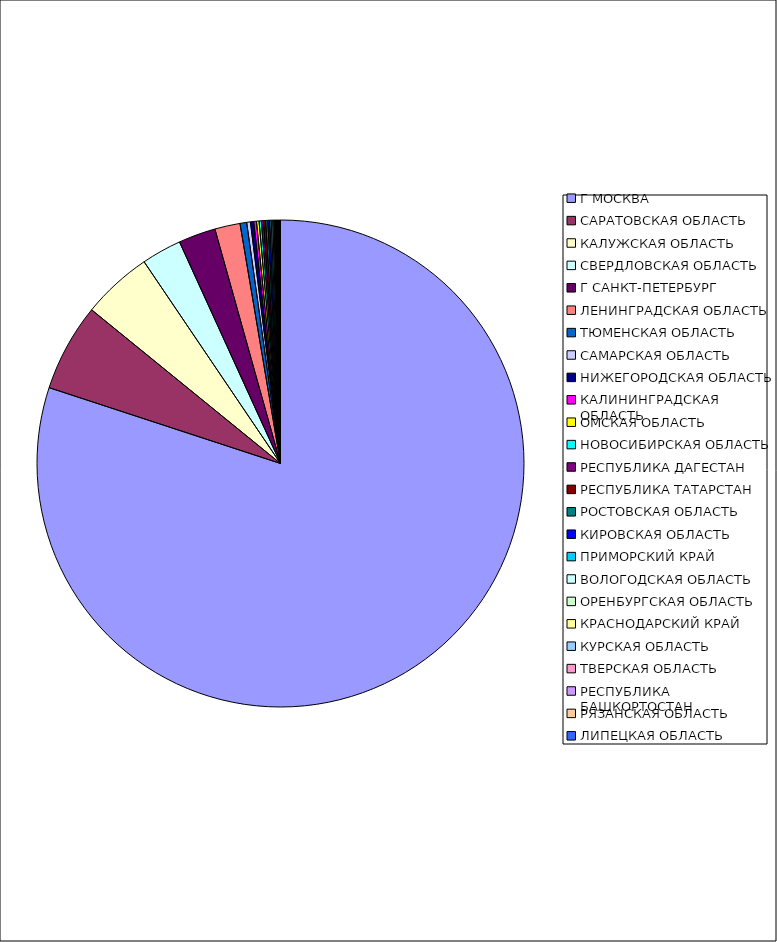
| Category | Оборот |
|---|---|
| Г МОСКВА | 0.8 |
| САРАТОВСКАЯ ОБЛАСТЬ | 0.058 |
| КАЛУЖСКАЯ ОБЛАСТЬ | 0.047 |
| СВЕРДЛОВСКАЯ ОБЛАСТЬ | 0.027 |
| Г САНКТ-ПЕТЕРБУРГ | 0.025 |
| ЛЕНИНГРАДСКАЯ ОБЛАСТЬ | 0.017 |
| ТЮМЕНСКАЯ ОБЛАСТЬ | 0.004 |
| САМАРСКАЯ ОБЛАСТЬ | 0.002 |
| НИЖЕГОРОДСКАЯ ОБЛАСТЬ | 0.002 |
| КАЛИНИНГРАДСКАЯ ОБЛАСТЬ | 0.002 |
| ОМСКАЯ ОБЛАСТЬ | 0.002 |
| НОВОСИБИРСКАЯ ОБЛАСТЬ | 0.001 |
| РЕСПУБЛИКА ДАГЕСТАН | 0.001 |
| РЕСПУБЛИКА ТАТАРСТАН | 0.001 |
| РОСТОВСКАЯ ОБЛАСТЬ | 0.001 |
| КИРОВСКАЯ ОБЛАСТЬ | 0.001 |
| ПРИМОРСКИЙ КРАЙ | 0.001 |
| ВОЛОГОДСКАЯ ОБЛАСТЬ | 0.001 |
| ОРЕНБУРГСКАЯ ОБЛАСТЬ | 0.001 |
| КРАСНОДАРСКИЙ КРАЙ | 0 |
| КУРСКАЯ ОБЛАСТЬ | 0 |
| ТВЕРСКАЯ ОБЛАСТЬ | 0 |
| РЕСПУБЛИКА БАШКОРТОСТАН | 0 |
| РЯЗАНСКАЯ ОБЛАСТЬ | 0 |
| ЛИПЕЦКАЯ ОБЛАСТЬ | 0 |
| СМОЛЕНСКАЯ ОБЛАСТЬ | 0 |
| ЯРОСЛАВСКАЯ ОБЛАСТЬ | 0 |
| РЕСПУБЛИКА КОМИ | 0 |
| КАМЧАТСКИЙ КРАЙ | 0 |
| АЛТАЙСКИЙ КРАЙ | 0 |
| БРЯНСКАЯ ОБЛАСТЬ | 0 |
| ПЕРМСКИЙ КРАЙ | 0 |
| КРАСНОЯРСКИЙ КРАЙ | 0 |
| УДМУРТСКАЯ РЕСПУБЛИКА | 0 |
| РЕСПУБЛИКА СЕВЕРНАЯ ОСЕТИЯ-АЛАНИЯ | 0 |
| ТУЛЬСКАЯ ОБЛАСТЬ | 0 |
| ИВАНОВСКАЯ ОБЛАСТЬ | 0 |
| КАБАРДИНО-БАЛКАРСКАЯ РЕСПУБЛИКА | 0 |
| ЧЕЛЯБИНСКАЯ ОБЛАСТЬ | 0 |
| РЕСПУБЛИКА МОРДОВИЯ | 0 |
| СТАВРОПОЛЬСКИЙ КРАЙ | 0 |
| АМУРСКАЯ ОБЛАСТЬ | 0 |
| МУРМАНСКАЯ ОБЛАСТЬ | 0 |
| ПСКОВСКАЯ ОБЛАСТЬ | 0 |
| ИРКУТСКАЯ ОБЛАСТЬ | 0 |
| РЕСПУБЛИКА САХА(ЯКУТИЯ) | 0 |